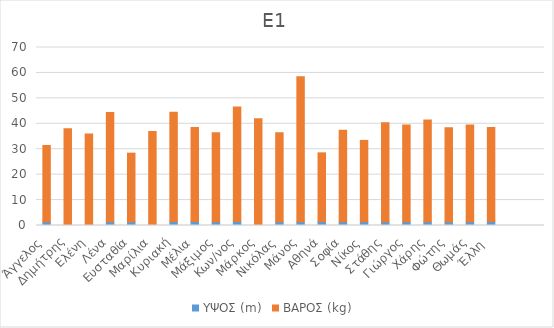
| Category | ΥΨΟΣ (m) | ΒΑΡΟΣ (kg)  |
|---|---|---|
| Άγγελος | 1.45 | 30 |
| Δημήτρης | 0 | 38 |
| Ελένη | 0 | 36 |
| Λένα | 1.48 | 43 |
| Ευσταθία | 1.44 | 27 |
| Μαρίλια | 0 | 37 |
| Κυριακή | 1.58 | 43 |
| Μέλια | 1.58 | 37 |
| Μάξιμος | 1.47 | 35 |
| Κων/νος | 1.58 | 45 |
| Μάρκος | 0 | 42 |
| Νικόλας | 1.47 | 35 |
| Μάνος | 1.46 | 57 |
| Αθηνά | 1.57 | 27 |
| Σοφία | 1.46 | 36 |
| Νίκος | 1.47 | 32 |
| Στάθης | 1.45 | 39 |
| Γιώργος | 1.51 | 38 |
| Χάρης | 1.48 | 40 |
| Φώτης | 1.44 | 37 |
| Θωμάς | 1.49 | 38 |
| Έλλη  | 1.56 | 37 |